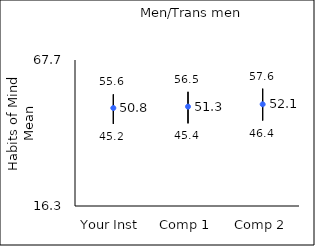
| Category | 25th percentile | 75th percentile | Mean |
|---|---|---|---|
| Your Inst | 45.2 | 55.6 | 50.8 |
| Comp 1 | 45.4 | 56.5 | 51.28 |
| Comp 2 | 46.4 | 57.6 | 52.11 |